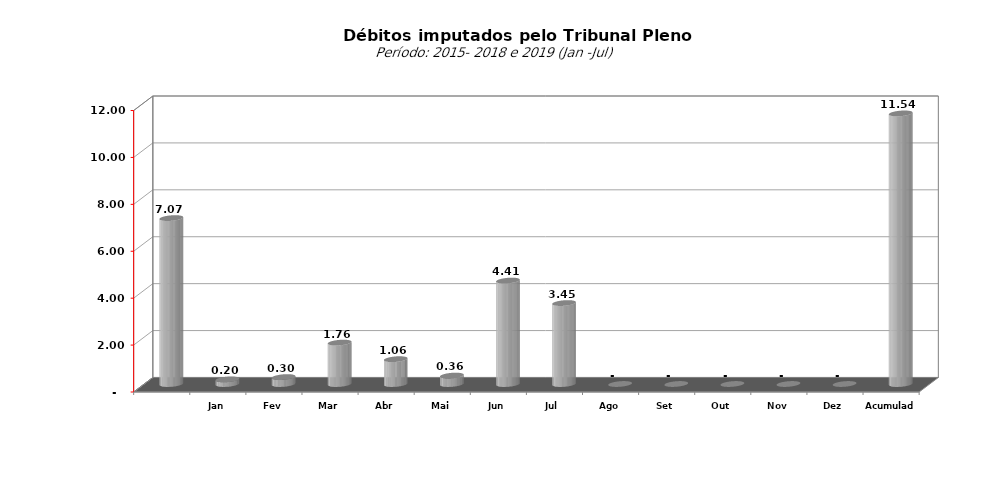
| Category |  7.073.154,74   5.749.129,25   4.727.033,51   16.081.820,48   21.535.723,60   8.578.266,09   25.676.499,17   10.592.915,18   197.255,77   296.375,09   1.764.671,00   1.058.511,33   358.973,08   4.409.150,19   3.450.817,21   -     -     -     -     -     1 |
|---|---|
|  | 7073154.74 |
| Jan | 197255.77 |
| Fev | 296375.09 |
| Mar | 1764671 |
| Abr | 1058511.33 |
| Mai | 358973.08 |
| Jun | 4409150.19 |
| Jul | 3450817.21 |
| Ago | 0 |
| Set | 0 |
| Out | 0 |
| Nov | 0 |
| Dez | 0 |
| Acumulado | 11535753.67 |